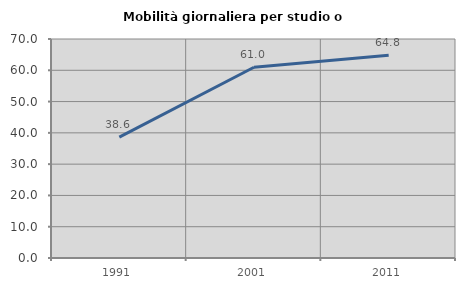
| Category | Mobilità giornaliera per studio o lavoro |
|---|---|
| 1991.0 | 38.639 |
| 2001.0 | 60.978 |
| 2011.0 | 64.825 |